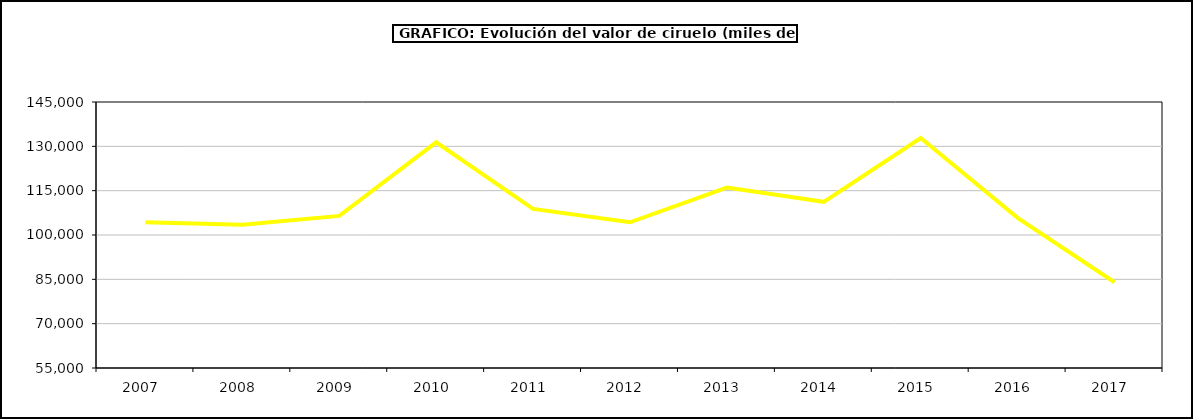
| Category | valor Ciruelo |
|---|---|
| 2007.0 | 104321.056 |
| 2008.0 | 103472.855 |
| 2009.0 | 106473.572 |
| 2010.0 | 131357.754 |
| 2011.0 | 108812.33 |
| 2012.0 | 104288.297 |
| 2013.0 | 116027.366 |
| 2014.0 | 111223.369 |
| 2015.0 | 132808 |
| 2016.0 | 105821 |
| 2017.0 | 84025.67 |